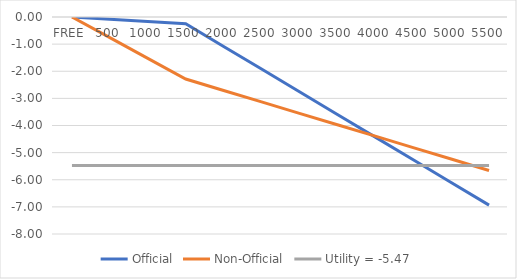
| Category | Official | Non-Official | Utility = -5.47 |
|---|---|---|---|
| FREE | 0 | 0 | -5.472 |
| 500 | -0.083 | -0.762 | -5.472 |
| 1000 | -0.166 | -1.525 | -5.472 |
| 1500 | -0.249 | -2.287 | -5.472 |
| 2000 | -1.084 | -2.708 | -5.472 |
| 2500 | -1.92 | -3.13 | -5.472 |
| 3000 | -2.756 | -3.551 | -5.472 |
| 3500 | -3.592 | -3.972 | -5.472 |
| 4000 | -4.428 | -4.393 | -5.472 |
| 4500 | -5.264 | -4.814 | -5.472 |
| 5000 | -6.1 | -5.236 | -5.472 |
| 5500 | -6.935 | -5.657 | -5.472 |